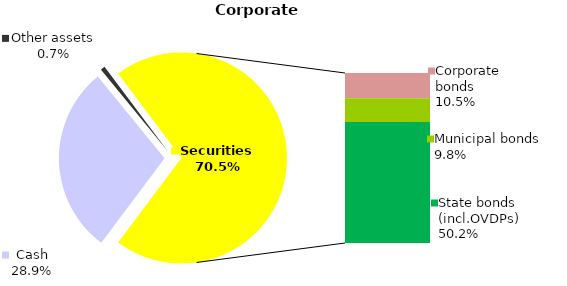
| Category | Corporate |
|---|---|
| Cash | 93.755 |
| Bank metals | 0 |
| Real estate | 0 |
| Other assets | 2.192 |
| Equities | 0.022 |
| Corporate bonds | 34.083 |
| Municipal bonds | 31.733 |
| State bonds (incl.OVDPs) | 163.069 |